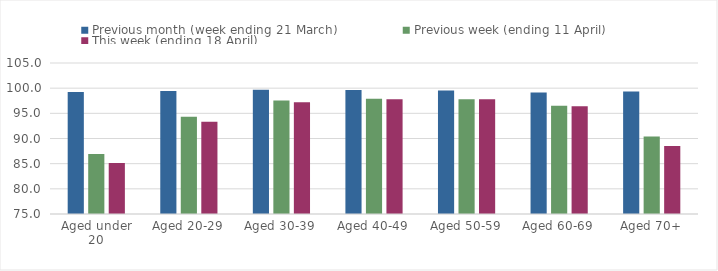
| Category | Previous month (week ending 21 March) | Previous week (ending 11 April) | This week (ending 18 April) |
|---|---|---|---|
| Aged under 20 | 99.237 | 86.913 | 85.147 |
| Aged 20-29 | 99.45 | 94.344 | 93.307 |
| Aged 30-39 | 99.675 | 97.528 | 97.22 |
| Aged 40-49 | 99.629 | 97.918 | 97.818 |
| Aged 50-59 | 99.534 | 97.776 | 97.812 |
| Aged 60-69 | 99.16 | 96.482 | 96.4 |
| Aged 70+ | 99.34 | 90.391 | 88.529 |